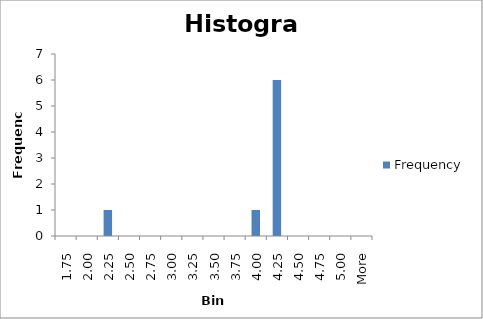
| Category | Frequency |
|---|---|
| 1.75 | 0 |
| 2.00 | 0 |
| 2.25 | 1 |
| 2.50 | 0 |
| 2.75 | 0 |
| 3.00 | 0 |
| 3.25 | 0 |
| 3.50 | 0 |
| 3.75 | 0 |
| 4.00 | 1 |
| 4.25 | 6 |
| 4.50 | 0 |
| 4.75 | 0 |
| 5.00 | 0 |
| More | 0 |